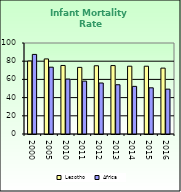
| Category | Lesotho | Africa |
|---|---|---|
| 2000.0 | 80.2 | 87.462 |
| 2005.0 | 82.5 | 73.418 |
| 2010.0 | 75.3 | 60.345 |
| 2011.0 | 73.2 | 58.107 |
| 2012.0 | 75 | 56.032 |
| 2013.0 | 75.2 | 54.131 |
| 2014.0 | 74.5 | 52.336 |
| 2015.0 | 74.5 | 50.754 |
| 2016.0 | 72.4 | 49.283 |